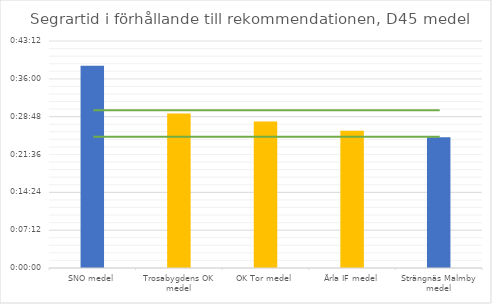
| Category | D45 tid |
|---|---|
| SNO medel | 0.027 |
| Trosabygdens OK medel | 0.02 |
| OK Tor medel | 0.019 |
| Ärla IF medel | 0.018 |
| Strängnäs Malmby medel | 0.017 |